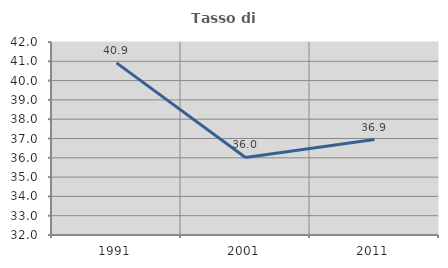
| Category | Tasso di occupazione   |
|---|---|
| 1991.0 | 40.918 |
| 2001.0 | 36.017 |
| 2011.0 | 36.943 |